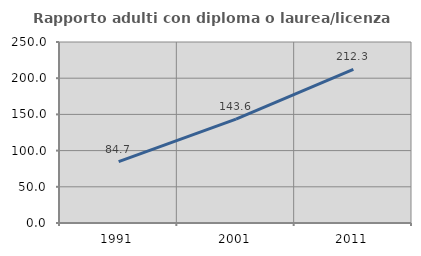
| Category | Rapporto adulti con diploma o laurea/licenza media  |
|---|---|
| 1991.0 | 84.653 |
| 2001.0 | 143.561 |
| 2011.0 | 212.261 |